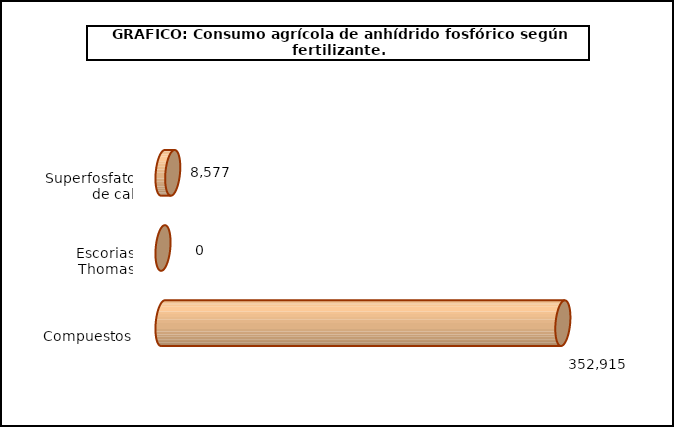
| Category | fert. N |
|---|---|
| 0 | 8576.91 |
| 1 | 0 |
| 2 | 352915.2 |